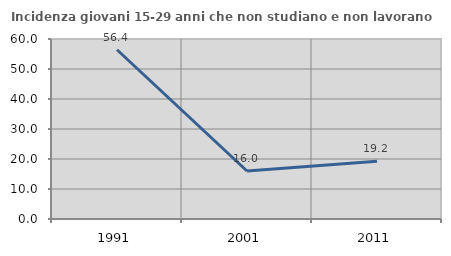
| Category | Incidenza giovani 15-29 anni che non studiano e non lavorano  |
|---|---|
| 1991.0 | 56.415 |
| 2001.0 | 16 |
| 2011.0 | 19.231 |